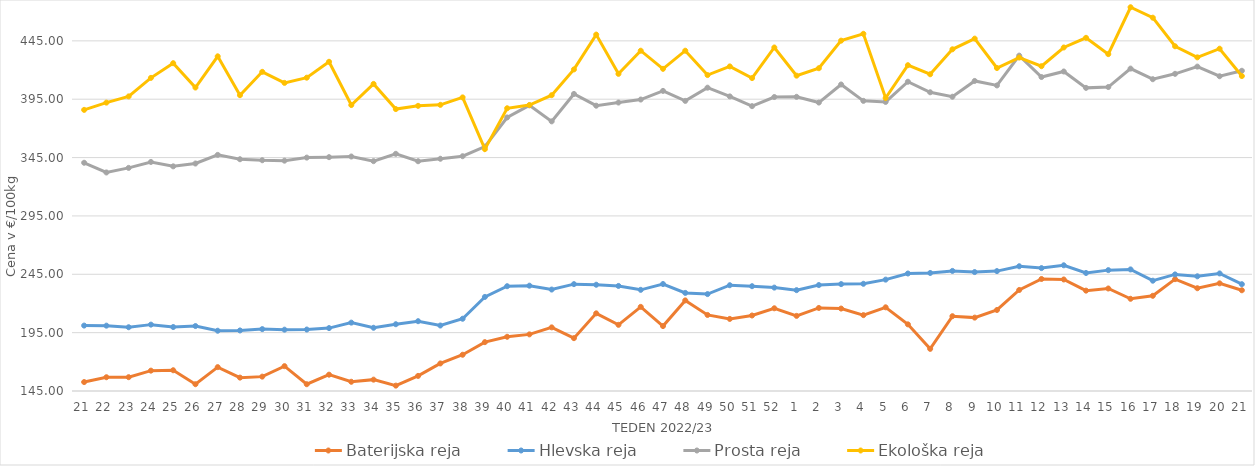
| Category | Baterijska reja | Hlevska reja | Prosta reja | Ekološka reja |
|---|---|---|---|---|
| 21.0 | 152.67 | 201.05 | 340.55 | 385.86 |
| 22.0 | 156.8 | 200.98 | 332.23 | 392.07 |
| 23.0 | 156.84 | 199.63 | 336.16 | 397.41 |
| 24.0 | 162.44 | 201.86 | 341.24 | 413.28 |
| 25.0 | 162.78 | 199.81 | 337.48 | 425.86 |
| 26.0 | 150.82 | 200.65 | 339.9 | 405 |
| 27.0 | 165.45 | 196.64 | 347.3 | 431.72 |
| 28.0 | 156.46 | 196.88 | 343.56 | 398.45 |
| 29.0 | 157.31 | 198.03 | 342.71 | 418.45 |
| 30.0 | 166.29 | 197.55 | 342.35 | 408.97 |
| 31.0 | 150.81 | 197.66 | 344.97 | 413.45 |
| 32.0 | 158.99 | 198.9 | 345.35 | 427.07 |
| 33.0 | 152.91 | 203.57 | 345.9 | 390 |
| 34.0 | 154.73 | 199.17 | 341.92 | 408.1 |
| 35.0 | 149.6 | 202.21 | 348.2 | 386.55 |
| 36.0 | 157.93 | 204.81 | 341.85 | 389.31 |
| 37.0 | 168.61 | 201.11 | 343.97 | 390.17 |
| 38.0 | 176.07 | 206.91 | 346.16 | 396.55 |
| 39.0 | 186.86 | 225.6 | 354.41 | 352.24 |
| 40.0 | 191.45 | 234.79 | 379.35 | 387.24 |
| 41.0 | 193.52 | 235.24 | 389.75 | 390 |
| 42.0 | 199.51 | 231.92 | 376.02 | 398.45 |
| 43.0 | 190.28 | 236.56 | 399.51 | 420.52 |
| 44.0 | 211.53 | 236.04 | 389.44 | 450.35 |
| 45.0 | 201.69 | 235.01 | 392.15 | 416.72 |
| 46.0 | 217.08 | 231.68 | 394.71 | 436.55 |
| 47.0 | 200.62 | 236.65 | 402.12 | 421.03 |
| 48.0 | 222.61 | 229.05 | 393.56 | 436.55 |
| 49.0 | 210.16 | 228.03 | 404.87 | 415.69 |
| 50.0 | 206.76 | 235.63 | 397.4 | 423.1 |
| 51.0 | 209.69 | 234.79 | 389.05 | 413.1 |
| 52.0 | 215.87 | 233.58 | 396.87 | 439.31 |
| 1.0 | 209.37 | 231.41 | 397.04 | 415.17 |
| 2.0 | 216.15 | 235.78 | 392.13 | 421.55 |
| 3.0 | 215.63 | 236.58 | 407.61 | 445.17 |
| 4.0 | 210 | 236.85 | 393.58 | 451.04 |
| 5.0 | 216.7 | 240.42 | 392.67 | 396.03 |
| 6.0 | 202.1 | 245.67 | 409.97 | 424.14 |
| 7.0 | 181.11 | 246.12 | 400.94 | 416.38 |
| 8.0 | 209.08 | 247.88 | 397.11 | 437.76 |
| 9.0 | 207.87 | 246.89 | 410.64 | 446.9 |
| 10.0 | 214.42 | 247.73 | 406.8 | 421.72 |
| 11.0 | 231.56 | 251.88 | 432.34 | 430.69 |
| 12.0 | 240.97 | 250.3 | 414 | 423.28 |
| 13.0 | 240.55 | 252.7 | 418.74 | 439.31 |
| 14.0 | 230.99 | 246.12 | 404.72 | 447.59 |
| 15.0 | 232.82 | 248.56 | 405.42 | 433.62 |
| 16.0 | 224 | 249.17 | 421.22 | 473.79 |
| 17.0 | 226.57 | 239.5 | 412.13 | 464.83 |
| 18.0 | 240.83 | 244.89 | 416.74 | 440.35 |
| 19.0 | 233.05 | 243.26 | 422.93 | 430.86 |
| 20.0 | 237.25 | 245.73 | 414.68 | 438.28 |
| 21.0 | 231.3 | 236.5 | 419.36 | 414.83 |